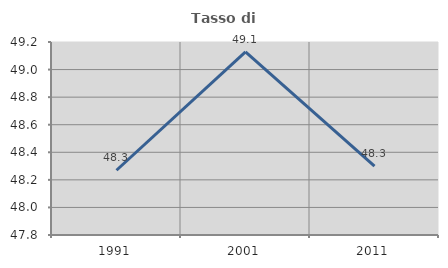
| Category | Tasso di occupazione   |
|---|---|
| 1991.0 | 48.27 |
| 2001.0 | 49.128 |
| 2011.0 | 48.299 |